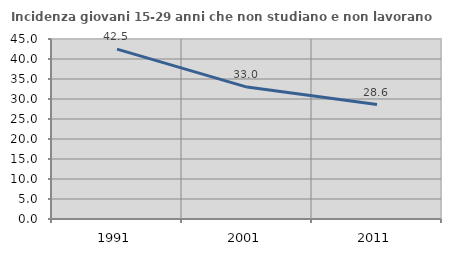
| Category | Incidenza giovani 15-29 anni che non studiano e non lavorano  |
|---|---|
| 1991.0 | 42.466 |
| 2001.0 | 32.982 |
| 2011.0 | 28.601 |